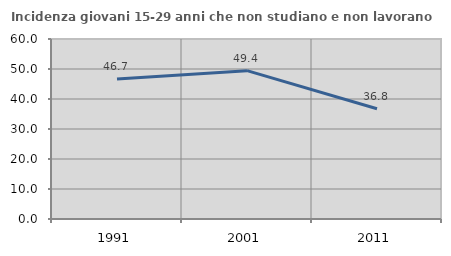
| Category | Incidenza giovani 15-29 anni che non studiano e non lavorano  |
|---|---|
| 1991.0 | 46.686 |
| 2001.0 | 49.446 |
| 2011.0 | 36.769 |